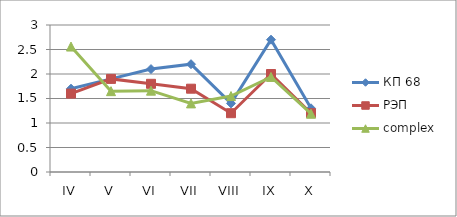
| Category | КП 68 | РЭП  | complex |
|---|---|---|---|
| IV | 1.7 | 1.6 | 2.56 |
| V | 1.9 | 1.9 | 1.65 |
| VI | 2.1 | 1.8 | 1.66 |
| VII | 2.2 | 1.7 | 1.4 |
| VIII | 1.4 | 1.2 | 1.55 |
| IX | 2.7 | 2 | 1.94 |
| X | 1.3 | 1.2 | 1.19 |